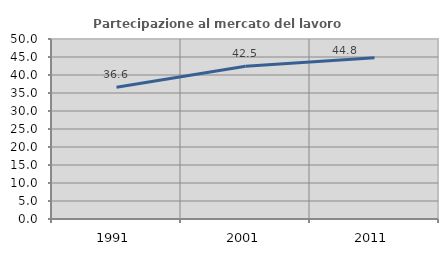
| Category | Partecipazione al mercato del lavoro  femminile |
|---|---|
| 1991.0 | 36.614 |
| 2001.0 | 42.458 |
| 2011.0 | 44.818 |